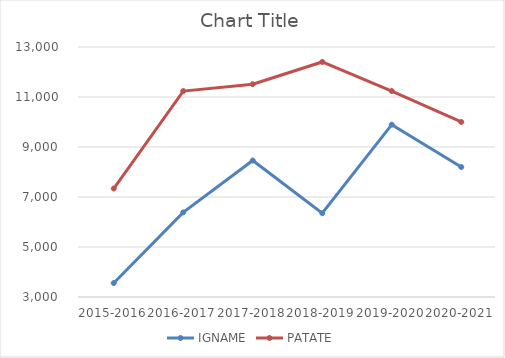
| Category |  IGNAME  |  PATATE  |
|---|---|---|
| 2015-2016 | 3558.342 | 7339.549 |
| 2016-2017 | 6385.659 | 11237.569 |
| 2017-2018 | 8460.167 | 11510.796 |
| 2018-2019 | 6351.905 | 12401.334 |
| 2019-2020 | 9893.856 | 11238.845 |
| 2020-2021 | 8197.951 | 10000.373 |